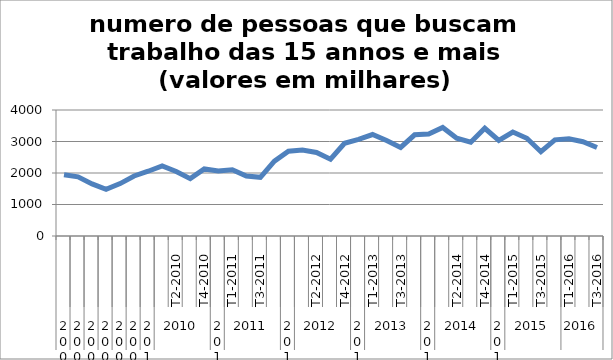
| Category | numero de pessoas que buscam trabalho das 15 annos e mais (valores em milhares) |
|---|---|
| 0 | 1944.135 |
| 1 | 1877.292 |
| 2 | 1654.297 |
| 3 | 1480.901 |
| 4 | 1664.316 |
| 5 | 1906.556 |
| 6 | 2055.718 |
| 7 | 2223.647 |
| 8 | 2048.181 |
| 9 | 1821.885 |
| 10 | 2129.157 |
| 11 | 2061.298 |
| 12 | 2105.406 |
| 13 | 1904.017 |
| 14 | 1861.686 |
| 15 | 2374.082 |
| 16 | 2691.016 |
| 17 | 2729.059 |
| 18 | 2650.841 |
| 19 | 2438.999 |
| 20 | 2945.166 |
| 21 | 3068.664 |
| 22 | 3221.494 |
| 23 | 3029.455 |
| 24 | 2811.707 |
| 25 | 3212 |
| 26 | 3236.007 |
| 27 | 3446.728 |
| 28 | 3102.389 |
| 29 | 2975.398 |
| 30 | 3419.513 |
| 31 | 3033.253 |
| 32 | 3301.807 |
| 33 | 3101.498 |
| 34 | 2676.548 |
| 35 | 3053.159 |
| 36 | 3086.802 |
| 37 | 2992.503 |
| 38 | 2808.126 |